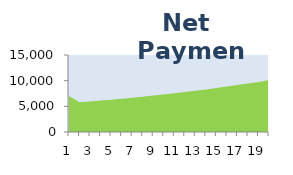
| Category | Net _x000d_Payment |
|---|---|
| 0 | 7031.421 |
| 1 | 5777.521 |
| 2 | 5944.871 |
| 3 | 6118.676 |
| 4 | 6299.251 |
| 5 | 6486.93 |
| 6 | 6682.065 |
| 7 | 6885.026 |
| 8 | 7096.205 |
| 9 | 7316.016 |
| 10 | 7544.897 |
| 11 | 7783.31 |
| 12 | 8031.741 |
| 13 | 8290.707 |
| 14 | 8560.752 |
| 15 | 8842.452 |
| 16 | 9136.415 |
| 17 | 9443.284 |
| 18 | 9763.739 |
| 19 | 10098.498 |